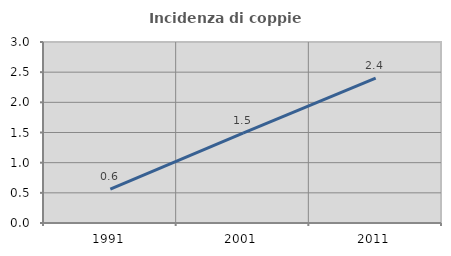
| Category | Incidenza di coppie miste |
|---|---|
| 1991.0 | 0.56 |
| 2001.0 | 1.489 |
| 2011.0 | 2.402 |